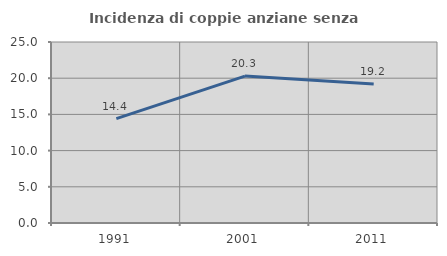
| Category | Incidenza di coppie anziane senza figli  |
|---|---|
| 1991.0 | 14.42 |
| 2001.0 | 20.294 |
| 2011.0 | 19.207 |